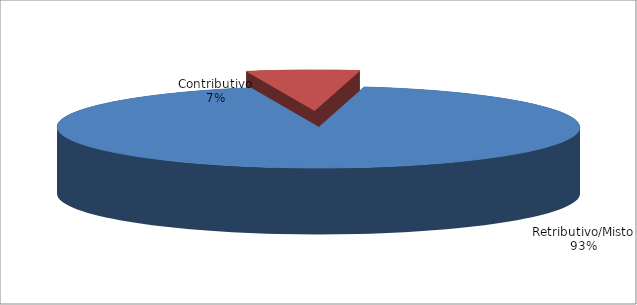
| Category | Series 1 |
|---|---|
| Retributivo/Misto | 244671 |
| Contributivo | 18330 |